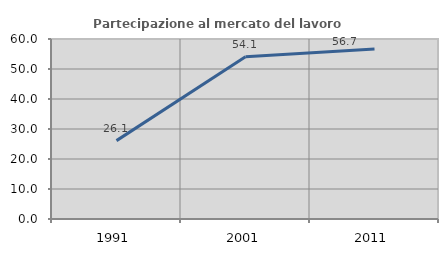
| Category | Partecipazione al mercato del lavoro  femminile |
|---|---|
| 1991.0 | 26.126 |
| 2001.0 | 54.082 |
| 2011.0 | 56.701 |